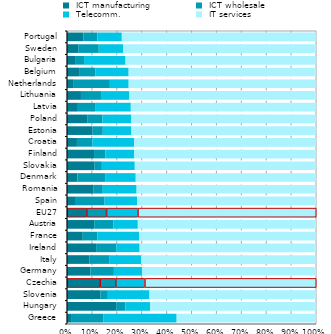
| Category |  ICT manufacturing |  ICT wholesale |  Telecomm. |  IT services |
|---|---|---|---|---|
| Greece | 0.019 | 0.126 | 0.295 | 0.56 |
| Hungary | 0.198 | 0.037 | 0.099 | 0.667 |
| Slovenia | 0.134 | 0.03 | 0.167 | 0.669 |
| Czechia | 0.133 | 0.063 | 0.117 | 0.688 |
| Germany | 0.095 | 0.094 | 0.113 | 0.699 |
| Italy | 0.089 | 0.082 | 0.126 | 0.703 |
| Ireland | 0.117 | 0.081 | 0.094 | 0.708 |
| France | 0.063 | 0.058 | 0.168 | 0.71 |
| Austria | 0.109 | 0.076 | 0.099 | 0.716 |
| EU27 | 0.079 | 0.079 | 0.126 | 0.716 |
| Spain | 0.036 | 0.115 | 0.131 | 0.718 |
| Romania | 0.107 | 0.037 | 0.136 | 0.72 |
| Denmark | 0.042 | 0.111 | 0.123 | 0.724 |
| Slovakia | 0.109 | 0.031 | 0.132 | 0.728 |
| Finland | 0.109 | 0.046 | 0.116 | 0.73 |
| Croatia | 0.04 | 0.062 | 0.168 | 0.73 |
| Estonia | 0.103 | 0.041 | 0.115 | 0.741 |
| Poland | 0.083 | 0.06 | 0.116 | 0.742 |
| Latvia | 0.044 | 0.069 | 0.144 | 0.744 |
| Lithuania | 0.056 | 0.081 | 0.114 | 0.749 |
| Netherlands | 0.027 | 0.145 | 0.076 | 0.752 |
| Belgium | 0.049 | 0.066 | 0.133 | 0.752 |
| Bulgaria | 0.035 | 0.033 | 0.167 | 0.765 |
| Sweden | 0.045 | 0.083 | 0.098 | 0.774 |
| Portugal | 0.066 | 0.057 | 0.098 | 0.78 |